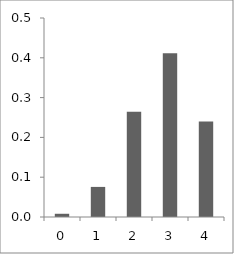
| Category | Series 0 |
|---|---|
| 0.0 | 0.008 |
| 1.0 | 0.076 |
| 2.0 | 0.265 |
| 3.0 | 0.412 |
| 4.0 | 0.24 |